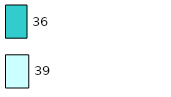
| Category | Series 0 | Series 1 |
|---|---|---|
| 0 | 39 | 36 |